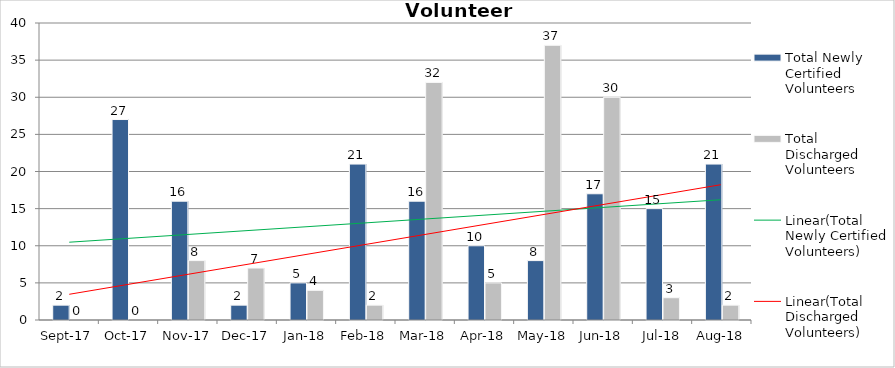
| Category | Total Newly Certified Volunteers | Total Discharged Volunteers |
|---|---|---|
| 2017-09-01 | 2 | 0 |
| 2017-10-01 | 27 | 0 |
| 2017-11-01 | 16 | 8 |
| 2017-12-01 | 2 | 7 |
| 2018-01-01 | 5 | 4 |
| 2018-02-01 | 21 | 2 |
| 2018-03-01 | 16 | 32 |
| 2018-04-01 | 10 | 5 |
| 2018-05-01 | 8 | 37 |
| 2018-06-01 | 17 | 30 |
| 2018-07-01 | 15 | 3 |
| 2018-08-01 | 21 | 2 |